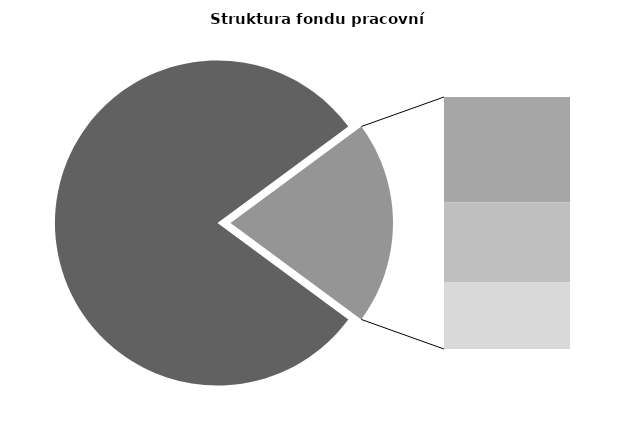
| Category | Series 0 |
|---|---|
| Průměrná měsíční odpracovaná doba bez přesčasu | 134.748 |
| Dovolená | 14.308 |
| Nemoc | 10.791 |
| Jiné | 9.067 |